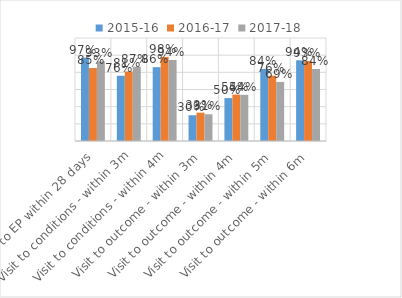
| Category | 2015-16 | 2016-17 | 2017-18 |
|---|---|---|---|
| Report to EP within 28 days | 0.97 | 0.85 | 0.927 |
| Visit to conditions - within 3m | 0.76 | 0.81 | 0.865 |
| Visit to conditions - within 4m | 0.86 | 0.98 | 0.944 |
| Visit to outcome - within 3m | 0.3 | 0.33 | 0.312 |
| Visit to outcome - within 4m | 0.5 | 0.54 | 0.538 |
| Visit to outcome - within 5m | 0.84 | 0.76 | 0.688 |
| Visit to outcome - within 6m | 0.94 | 0.93 | 0.839 |